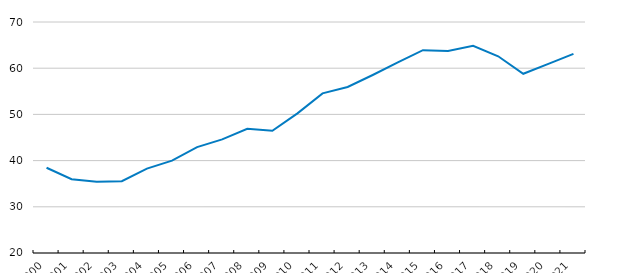
| Category | Series 1 |
|---|---|
| 2000.0 | 38.455 |
| 2001.0 | 35.965 |
| 2002.0 | 35.402 |
| 2003.0 | 35.544 |
| 2004.0 | 38.268 |
| 2005.0 | 39.982 |
| 2006.0 | 42.919 |
| 2007.0 | 44.59 |
| 2008.0 | 46.904 |
| 2009.0 | 46.464 |
| 2010.0 | 50.231 |
| 2011.0 | 54.546 |
| 2012.0 | 55.934 |
| 2013.0 | 58.533 |
| 2014.0 | 61.275 |
| 2015.0 | 63.893 |
| 2016.0 | 63.738 |
| 2017.0 | 64.835 |
| 2018.0 | 62.582 |
| 2019.0 | 58.788 |
| 2020.0 | 60.949 |
| 2021.0 | 63.11 |